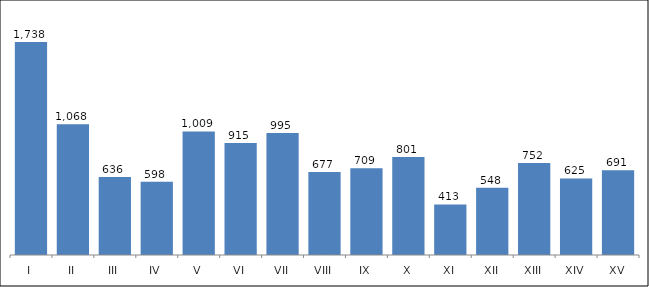
| Category | Series 0 |
|---|---|
| I | 1738 |
| II | 1068 |
| III | 636 |
| IV | 598 |
| V | 1009 |
| VI | 915 |
| VII | 995 |
| VIII | 677 |
| IX | 709 |
| X | 801 |
| XI | 413 |
| XII | 548 |
| XIII | 752 |
| XIV | 625 |
| XV | 691 |